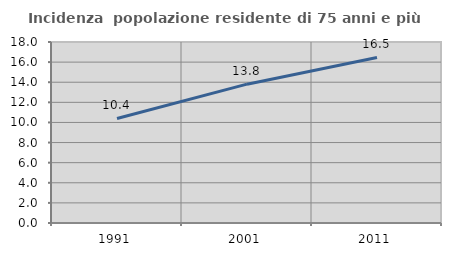
| Category | Incidenza  popolazione residente di 75 anni e più |
|---|---|
| 1991.0 | 10.396 |
| 2001.0 | 13.807 |
| 2011.0 | 16.459 |